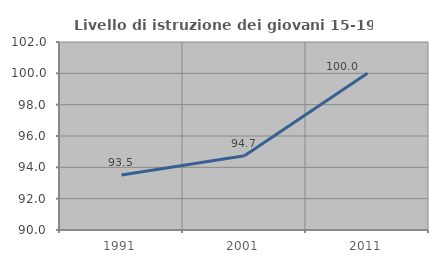
| Category | Livello di istruzione dei giovani 15-19 anni |
|---|---|
| 1991.0 | 93.506 |
| 2001.0 | 94.737 |
| 2011.0 | 100 |